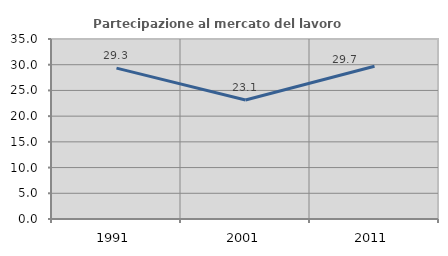
| Category | Partecipazione al mercato del lavoro  femminile |
|---|---|
| 1991.0 | 29.331 |
| 2001.0 | 23.148 |
| 2011.0 | 29.707 |